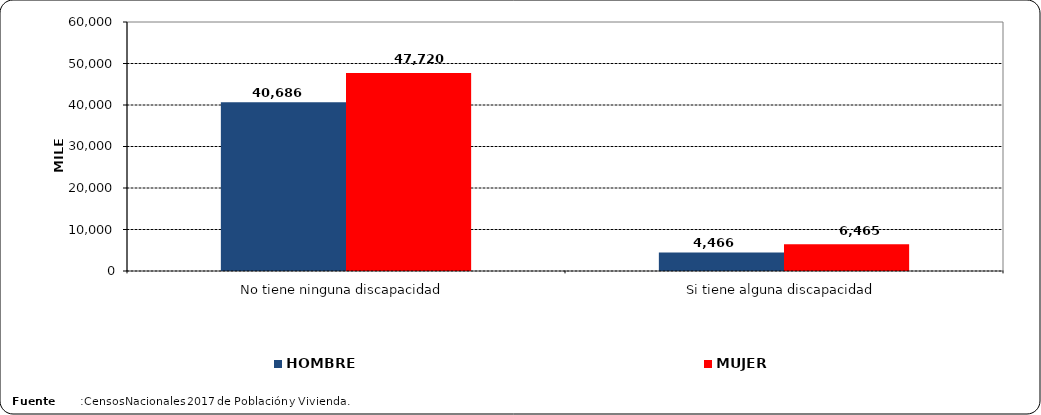
| Category | HOMBRE | MUJER |
|---|---|---|
| No tiene ninguna discapacidad | 40686 | 47720 |
| Si tiene alguna discapacidad | 4466 | 6465 |